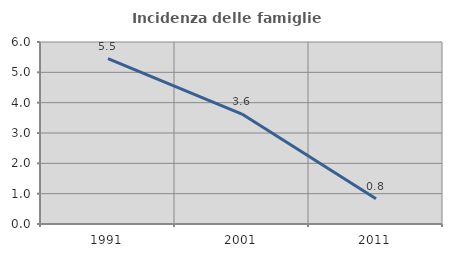
| Category | Incidenza delle famiglie numerose |
|---|---|
| 1991.0 | 5.455 |
| 2001.0 | 3.625 |
| 2011.0 | 0.831 |